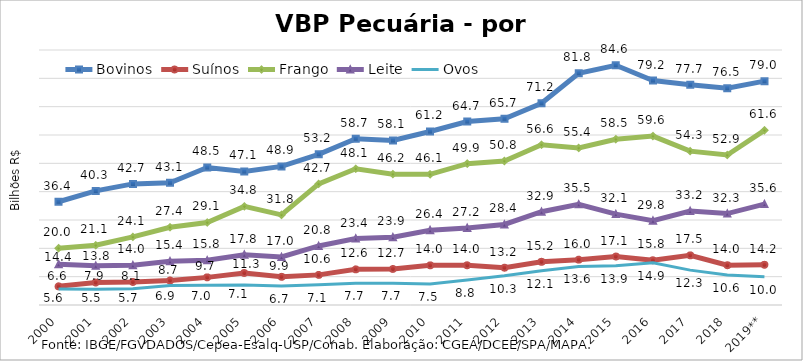
| Category | Bovinos | Suínos | Frango | Leite | Ovos |
|---|---|---|---|---|---|
| 2000 | 36.436 | 6.597 | 20.049 | 14.392 | 5.627 |
| 2001 | 40.276 | 7.915 | 21.073 | 13.849 | 5.545 |
| 2002 | 42.741 | 8.112 | 24.054 | 14.023 | 5.713 |
| 2003 | 43.136 | 8.67 | 27.423 | 15.442 | 6.91 |
| 2004 | 48.533 | 9.747 | 29.12 | 15.783 | 7.004 |
| 2005 | 47.119 | 11.301 | 34.815 | 17.751 | 7.051 |
| 2006 | 48.921 | 9.941 | 31.805 | 16.956 | 6.698 |
| 2007 | 53.166 | 10.63 | 42.733 | 20.844 | 7.119 |
| 2008 | 58.702 | 12.587 | 48.104 | 23.449 | 7.688 |
| 2009 | 58.089 | 12.724 | 46.186 | 23.906 | 7.666 |
| 2010 | 61.244 | 13.997 | 46.131 | 26.401 | 7.456 |
| 2011 | 64.744 | 14.019 | 49.892 | 27.216 | 8.785 |
| 2012 | 65.709 | 13.163 | 50.824 | 28.44 | 10.298 |
| 2013 | 71.205 | 15.241 | 56.567 | 32.911 | 12.112 |
| 2014 | 81.802 | 16.008 | 55.423 | 35.539 | 13.609 |
| 2015 | 84.617 | 17.108 | 58.51 | 32.08 | 13.856 |
| 2016 | 79.206 | 15.788 | 59.617 | 29.767 | 14.938 |
| 2017 | 77.727 | 17.526 | 54.301 | 33.166 | 12.313 |
| 2018 | 76.507 | 14.036 | 52.941 | 32.263 | 10.587 |
| 2019** | 79.009 | 14.18 | 61.649 | 35.606 | 9.992 |